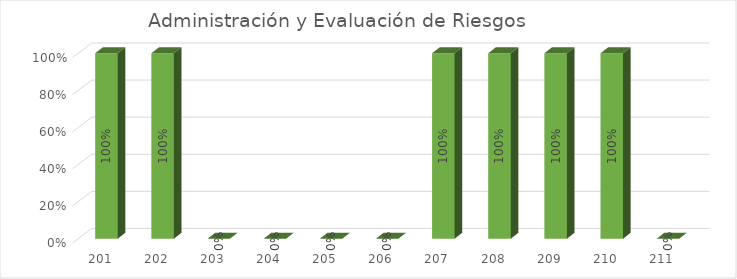
| Category | % Avance |
|---|---|
| 201.0 | 1 |
| 202.0 | 1 |
| 203.0 | 0 |
| 204.0 | 0 |
| 205.0 | 0 |
| 206.0 | 0 |
| 207.0 | 1 |
| 208.0 | 1 |
| 209.0 | 1 |
| 210.0 | 1 |
| 211.0 | 0 |